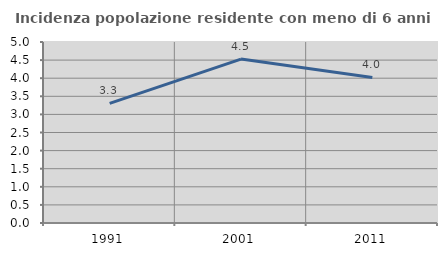
| Category | Incidenza popolazione residente con meno di 6 anni |
|---|---|
| 1991.0 | 3.303 |
| 2001.0 | 4.527 |
| 2011.0 | 4.02 |